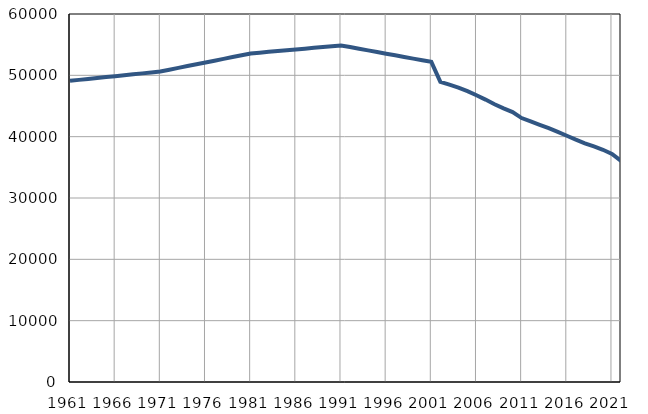
| Category | Population
size |
|---|---|
| 1961.0 | 49107 |
| 1962.0 | 49259 |
| 1963.0 | 49410 |
| 1964.0 | 49562 |
| 1965.0 | 49714 |
| 1966.0 | 49866 |
| 1967.0 | 50017 |
| 1968.0 | 50169 |
| 1969.0 | 50321 |
| 1970.0 | 50472 |
| 1971.0 | 50624 |
| 1972.0 | 50918 |
| 1973.0 | 51213 |
| 1974.0 | 51508 |
| 1975.0 | 51802 |
| 1976.0 | 52097 |
| 1977.0 | 52391 |
| 1978.0 | 52686 |
| 1979.0 | 52981 |
| 1980.0 | 53275 |
| 1981.0 | 53570 |
| 1982.0 | 53700 |
| 1983.0 | 53831 |
| 1984.0 | 53961 |
| 1985.0 | 54091 |
| 1986.0 | 54222 |
| 1987.0 | 54352 |
| 1988.0 | 54482 |
| 1989.0 | 54612 |
| 1990.0 | 54743 |
| 1991.0 | 54873 |
| 1992.0 | 54605 |
| 1993.0 | 54337 |
| 1994.0 | 54069 |
| 1995.0 | 53801 |
| 1996.0 | 53533 |
| 1997.0 | 53265 |
| 1998.0 | 52997 |
| 1999.0 | 52729 |
| 2000.0 | 52461 |
| 2001.0 | 52193 |
| 2002.0 | 48944 |
| 2003.0 | 48474 |
| 2004.0 | 47990 |
| 2005.0 | 47422 |
| 2006.0 | 46758 |
| 2007.0 | 46046 |
| 2008.0 | 45287 |
| 2009.0 | 44610 |
| 2010.0 | 43998 |
| 2011.0 | 43031 |
| 2012.0 | 42475 |
| 2013.0 | 41939 |
| 2014.0 | 41381 |
| 2015.0 | 40777 |
| 2016.0 | 40145 |
| 2017.0 | 39510 |
| 2018.0 | 38915 |
| 2019.0 | 38401 |
| 2020.0 | 37862 |
| 2021.0 | 37181 |
| 2022.0 | 36055 |